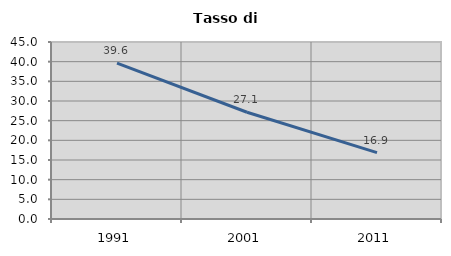
| Category | Tasso di disoccupazione   |
|---|---|
| 1991.0 | 39.619 |
| 2001.0 | 27.146 |
| 2011.0 | 16.888 |